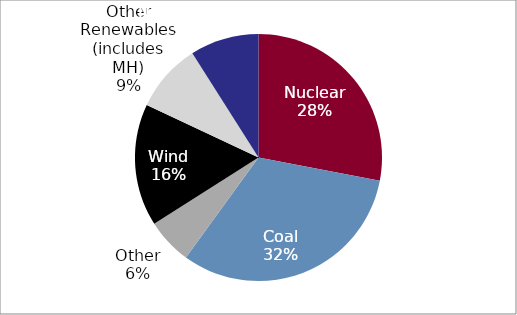
| Category | Series 0 |
|---|---|
| Nuclear | 0.28 |
| Coal | 0.32 |
| Other | 0.06 |
| Wind | 0.16 |
| Other Renewables (includes MH) | 0.09 |
| Natural Gas | 0.09 |